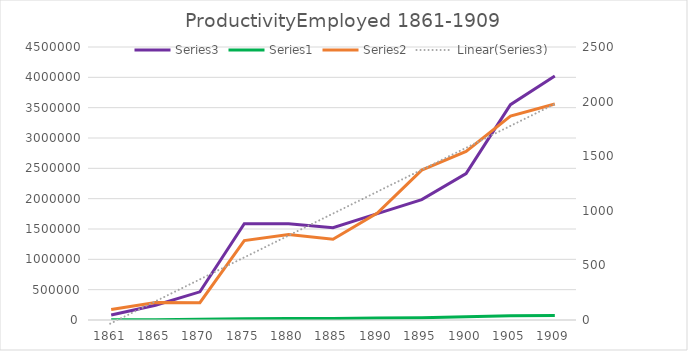
| Category | Series 2 |
|---|---|
| 1861.0 | 81291 |
| 1865.0 | 243007 |
| 1870.0 | 464280 |
| 1875.0 | 1587581 |
| 1880.0 | 1585562 |
| 1885.0 | 1522649 |
| 1890.0 | 1752878 |
| 1895.0 | 1983844 |
| 1900.0 | 2413989 |
| 1905.0 | 3550276 |
| 1909.0 | 4021783 |